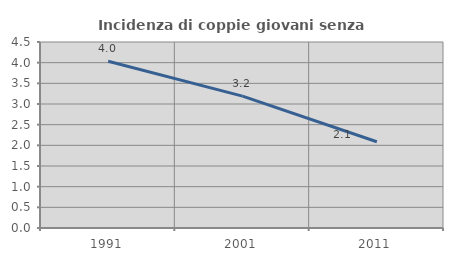
| Category | Incidenza di coppie giovani senza figli |
|---|---|
| 1991.0 | 4.035 |
| 2001.0 | 3.19 |
| 2011.0 | 2.086 |